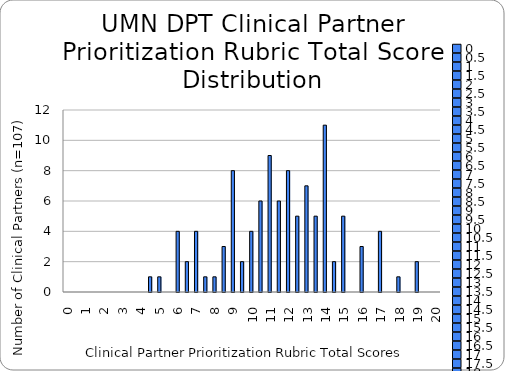
| Category | Series 0 |
|---|---|
| 0.0 | 0 |
| 0.5 | 0 |
| 1.0 | 0 |
| 1.5 | 0 |
| 2.0 | 0 |
| 2.5 | 0 |
| 3.0 | 0 |
| 3.5 | 0 |
| 4.0 | 0 |
| 4.5 | 1 |
| 5.0 | 1 |
| 5.5 | 0 |
| 6.0 | 4 |
| 6.5 | 2 |
| 7.0 | 4 |
| 7.5 | 1 |
| 8.0 | 1 |
| 8.5 | 3 |
| 9.0 | 8 |
| 9.5 | 2 |
| 10.0 | 4 |
| 10.5 | 6 |
| 11.0 | 9 |
| 11.5 | 6 |
| 12.0 | 8 |
| 12.5 | 5 |
| 13.0 | 7 |
| 13.5 | 5 |
| 14.0 | 11 |
| 14.5 | 2 |
| 15.0 | 5 |
| 15.5 | 0 |
| 16.0 | 3 |
| 16.5 | 0 |
| 17.0 | 4 |
| 17.5 | 0 |
| 18.0 | 1 |
| 18.5 | 0 |
| 19.0 | 2 |
| 19.5 | 0 |
| 20.0 | 0 |